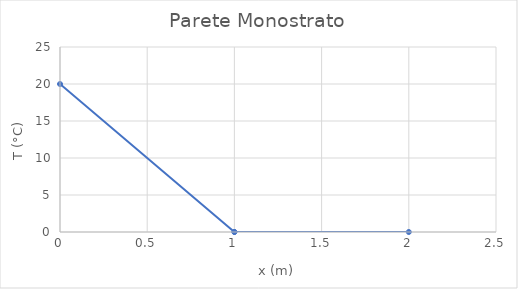
| Category | T (°C) |
|---|---|
| 0.0 | 20 |
| 1.0 | 0 |
| 1.0 | 0 |
| 2.0 | 0 |